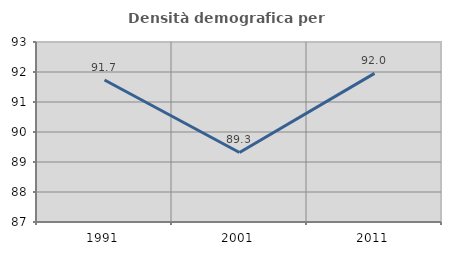
| Category | Densità demografica |
|---|---|
| 1991.0 | 91.732 |
| 2001.0 | 89.317 |
| 2011.0 | 91.954 |